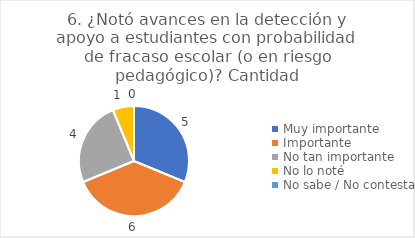
| Category | 6. ¿Notó avances en la detección y apoyo a estudiantes con probabilidad de fracaso escolar (o en riesgo pedagógico)? |
|---|---|
| Muy importante  | 0.312 |
| Importante  | 0.375 |
| No tan importante  | 0.25 |
| No lo noté  | 0.062 |
| No sabe / No contesta | 0 |